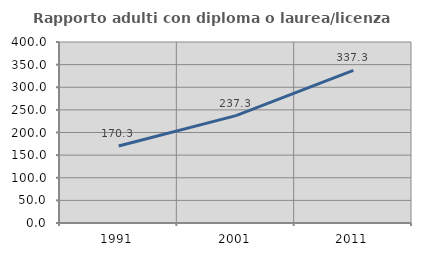
| Category | Rapporto adulti con diploma o laurea/licenza media  |
|---|---|
| 1991.0 | 170.284 |
| 2001.0 | 237.321 |
| 2011.0 | 337.329 |